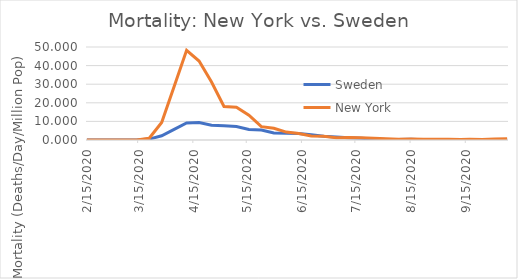
| Category | Sweden | New York |
|---|---|---|
| 2/15/20 | 0 | 0 |
| 2/22/20 | 0 | 0 |
| 2/29/20 | 0 | 0 |
| 3/7/20 | 0 | 0 |
| 3/14/20 | 0 | 0 |
| 3/21/20 | 0.494 | 0.925 |
| 3/28/20 | 2.274 | 9.407 |
| 4/4/20 | 5.735 | 28.734 |
| 4/11/20 | 9.196 | 48.216 |
| 4/18/20 | 9.394 | 42.459 |
| 4/25/20 | 7.911 | 31.15 |
| 5/2/20 | 7.614 | 18.043 |
| 5/9/20 | 7.218 | 17.631 |
| 5/16/20 | 5.636 | 13.313 |
| 5/23/20 | 5.34 | 7.196 |
| 5/30/20 | 3.758 | 6.271 |
| 6/6/20 | 3.659 | 4.266 |
| 6/13/20 | 3.461 | 3.495 |
| 6/20/20 | 2.868 | 2.159 |
| 6/27/20 | 1.978 | 2.005 |
| 7/4/20 | 1.582 | 1.234 |
| 7/11/20 | 1.187 | 1.285 |
| 7/18/20 | 0.89 | 1.182 |
| 7/25/20 | 0.593 | 0.925 |
| 8/1/20 | 0.297 | 0.72 |
| 8/8/20 | 0.297 | 0.463 |
| 8/15/20 | 0.396 | 0.514 |
| 8/22/20 | 0.198 | 0.36 |
| 8/29/20 | 0.099 | 0.463 |
| 9/5/20 | 0.099 | 0.411 |
| 9/12/20 | 0.297 | 0.308 |
| 9/17/20 | 0.198 | 0.411 |
| 9/24/20 | 0.099 | 0.206 |
| 10/1/20 | 0.198 | 0.514 |
| 10/8/20 | 0.099 | 0.72 |